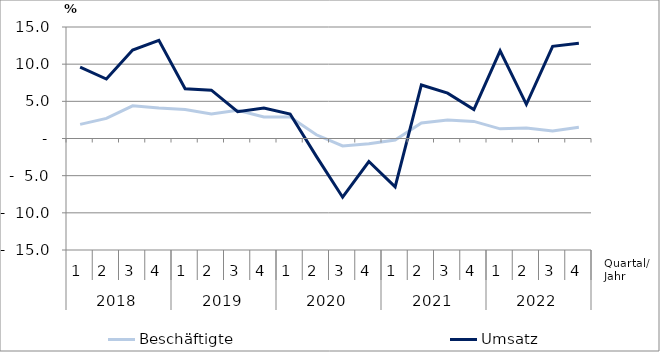
| Category | Beschäftigte | Umsatz |
|---|---|---|
| 0 | 1.9 | 9.6 |
| 1 | 2.7 | 8 |
| 2 | 4.4 | 11.9 |
| 3 | 4.1 | 13.2 |
| 4 | 3.9 | 6.7 |
| 5 | 3.3 | 6.5 |
| 6 | 3.8 | 3.6 |
| 7 | 2.9 | 4.1 |
| 8 | 2.9 | 3.3 |
| 9 | 0.5 | -2.4 |
| 10 | -1 | -7.9 |
| 11 | -0.7 | -3.1 |
| 12 | -0.2 | -6.5 |
| 13 | 2.1 | 7.2 |
| 14 | 2.5 | 6.1 |
| 15 | 2.3 | 3.9 |
| 16 | 1.3 | 11.8 |
| 17 | 1.4 | 4.6 |
| 18 | 1 | 12.4 |
| 19 | 1.5 | 12.8 |